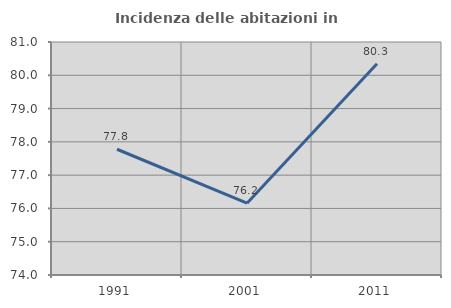
| Category | Incidenza delle abitazioni in proprietà  |
|---|---|
| 1991.0 | 77.778 |
| 2001.0 | 76.157 |
| 2011.0 | 80.345 |